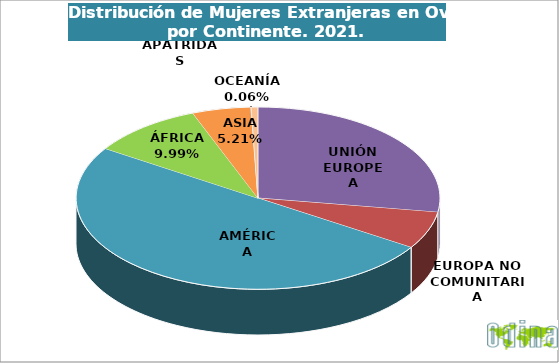
| Category | Mujeres |
|---|---|
| UNIÓN EUROPEA | 2246 |
| EUROPA NO COMUNITARIA | 540 |
| AMÉRICA | 4090 |
| ÁFRICA | 816 |
| ASIA | 426 |
| OCEANÍA | 5 |
| APÁTRIDAS | 46 |